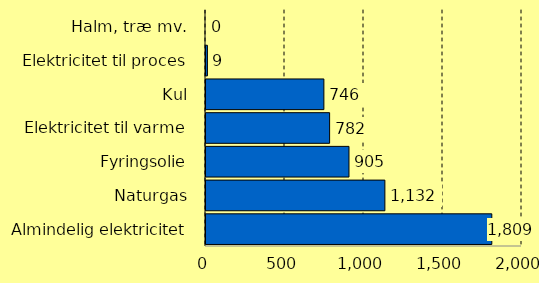
| Category | Series 0 |
|---|---|
| Almindelig elektricitet | 1808.911 |
| Naturgas | 1132.165 |
| Fyringsolie | 904.882 |
| Elektricitet til varme | 782.376 |
| Kul | 746.111 |
| Elektricitet til proces | 8.911 |
| Halm, træ mv. | 0 |